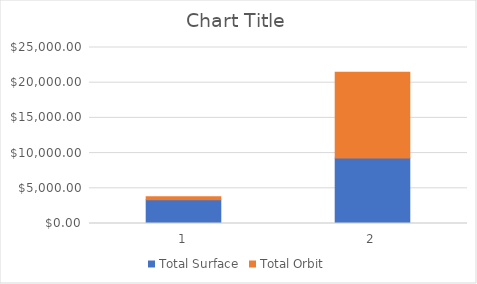
| Category | Total Surface | Total Orbit |
|---|---|---|
| 0 | 3359.213 | 434.848 |
| 1 | 9319.549 | 12173.721 |